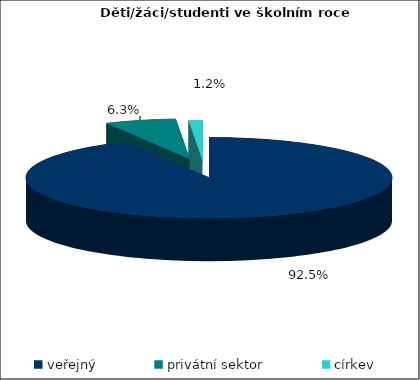
| Category | 2022/23 |
|---|---|
| veřejný | 1724623 |
| privátní sektor | 117387 |
| církev | 22649 |